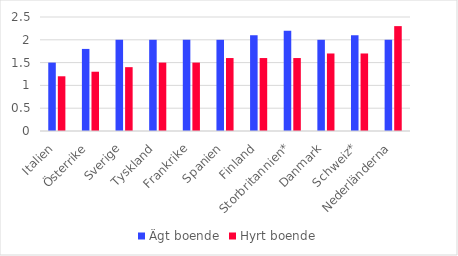
| Category | Ägt boende | Hyrt boende |
|---|---|---|
| Italien | 1.5 | 1.2 |
| Österrike | 1.8 | 1.3 |
| Sverige | 2 | 1.4 |
| Tyskland | 2 | 1.5 |
| Frankrike | 2 | 1.5 |
| Spanien | 2 | 1.6 |
| Finland | 2.1 | 1.6 |
| Storbritannien* | 2.2 | 1.6 |
| Danmark | 2 | 1.7 |
| Schweiz* | 2.1 | 1.7 |
| Nederländerna | 2 | 2.3 |